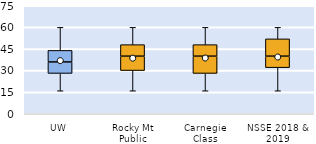
| Category | 25th | 50th | 75th |
|---|---|---|---|
| UW | 28 | 8 | 8 |
| Rocky Mt Public | 30 | 10 | 8 |
| Carnegie Class | 28 | 12 | 8 |
| NSSE 2018 & 2019 | 32 | 8 | 12 |